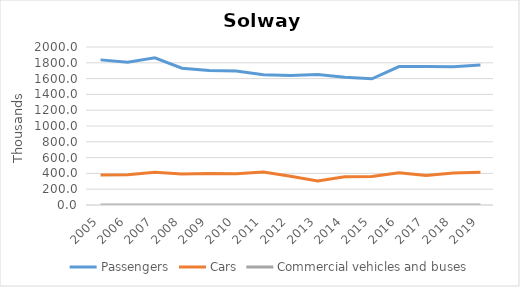
| Category | Passengers | Cars | Commercial vehicles and buses |
|---|---|---|---|
| 2005.0 | 1837 | 379 | 0 |
| 2006.0 | 1807 | 384 | 0 |
| 2007.0 | 1863 | 413 | 0 |
| 2008.0 | 1732 | 393 | 0 |
| 2009.0 | 1703 | 398 | 0 |
| 2010.0 | 1695 | 395 | 0 |
| 2011.0 | 1649.646 | 419.018 | 0 |
| 2012.0 | 1640.415 | 365.031 | 0 |
| 2013.0 | 1651 | 304.174 | 0 |
| 2014.0 | 1616.102 | 358.315 | 0 |
| 2015.0 | 1597.883 | 362.297 | 0 |
| 2016.0 | 1752.722 | 408.152 | 0 |
| 2017.0 | 1753.06 | 373.5 | 0 |
| 2018.0 | 1750 | 405.054 | 0 |
| 2019.0 | 1771 | 414.551 | 0 |